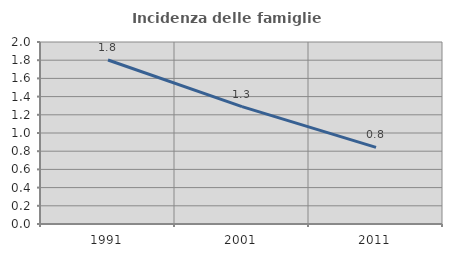
| Category | Incidenza delle famiglie numerose |
|---|---|
| 1991.0 | 1.802 |
| 2001.0 | 1.29 |
| 2011.0 | 0.842 |